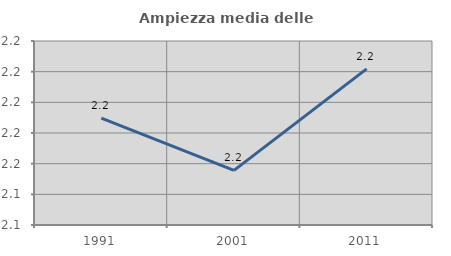
| Category | Ampiezza media delle famiglie |
|---|---|
| 1991.0 | 2.19 |
| 2001.0 | 2.156 |
| 2011.0 | 2.222 |